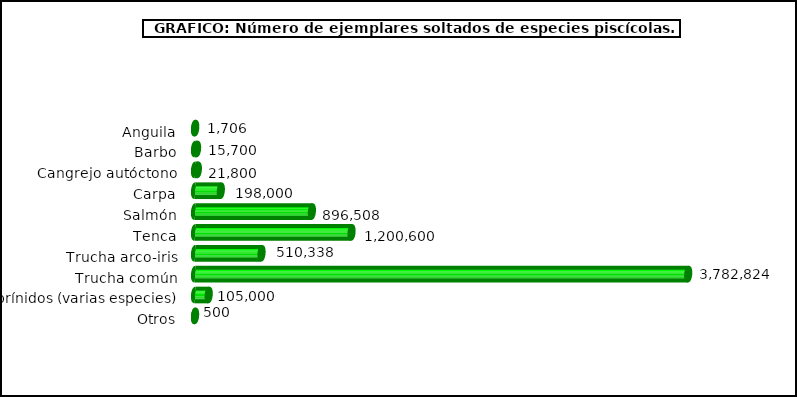
| Category | Series 1 |
|---|---|
| Anguila | 1706 |
| Barbo | 15700 |
| Cangrejo autóctono | 21800 |
| Carpa | 198000 |
| Salmón | 896508 |
| Tenca | 1200600 |
| Trucha arco-iris | 510338 |
| Trucha común | 3782824 |
| Otros: Ciprínidos (varias especies) | 105000 |
| Otros | 500 |